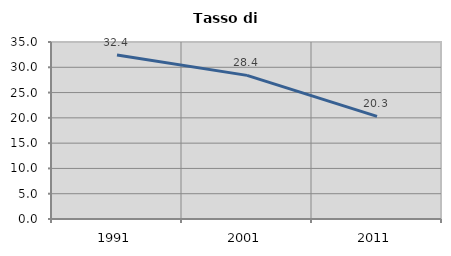
| Category | Tasso di disoccupazione   |
|---|---|
| 1991.0 | 32.434 |
| 2001.0 | 28.403 |
| 2011.0 | 20.299 |